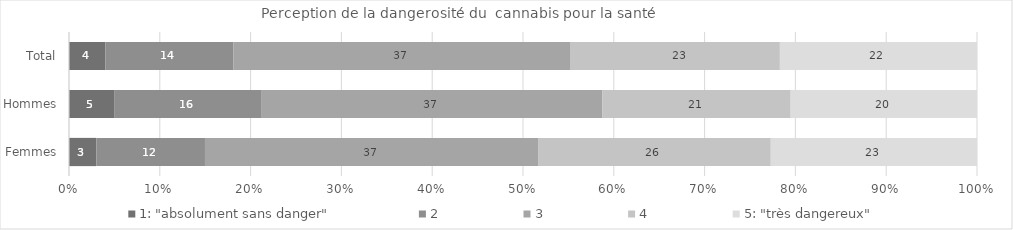
| Category | 1: "absolument sans danger" | 2 | 3 | 4 | 5: "très dangereux" |
|---|---|---|---|---|---|
| Total | 4 | 14 | 36.9 | 23 | 21.6 |
| Hommes | 5 | 16.1 | 37.3 | 20.6 | 20.4 |
| Femmes | 3 | 11.9 | 36.5 | 25.5 | 22.6 |